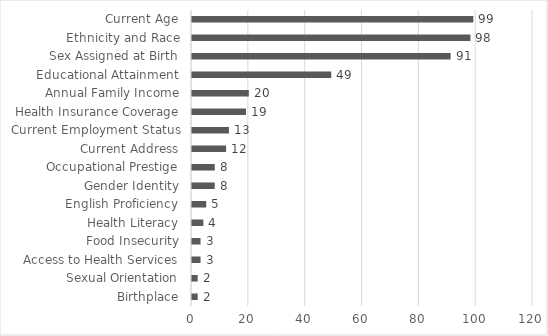
| Category | Count of Papers |
|---|---|
| Birthplace | 2 |
| Sexual Orientation | 2 |
| Access to Health Services | 3 |
| Food Insecurity | 3 |
| Health Literacy | 4 |
| English Proficiency | 5 |
| Gender Identity | 8 |
| Occupational Prestige | 8 |
| Current Address | 12 |
| Current Employment Status | 13 |
| Health Insurance Coverage | 19 |
| Annual Family Income | 20 |
| Educational Attainment | 49 |
| Sex Assigned at Birth | 91 |
| Ethnicity and Race | 98 |
| Current Age | 99 |